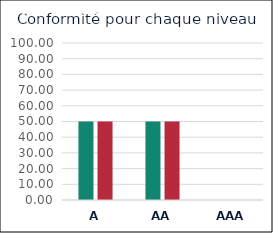
| Category | Series 0 | Series 1 |
|---|---|---|
| A | 50 | 50 |
| AA | 50 | 50 |
| AAA | 0 | 0 |